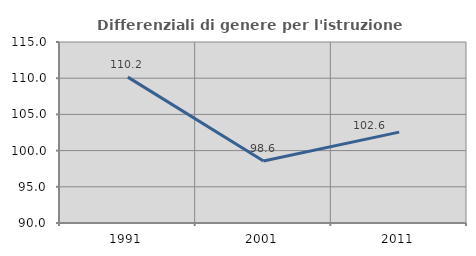
| Category | Differenziali di genere per l'istruzione superiore |
|---|---|
| 1991.0 | 110.151 |
| 2001.0 | 98.562 |
| 2011.0 | 102.553 |